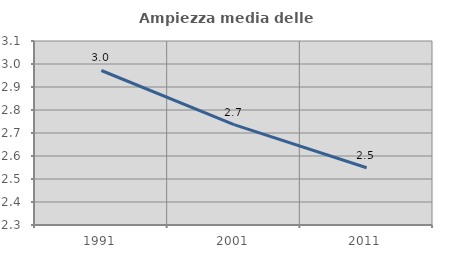
| Category | Ampiezza media delle famiglie |
|---|---|
| 1991.0 | 2.972 |
| 2001.0 | 2.736 |
| 2011.0 | 2.549 |